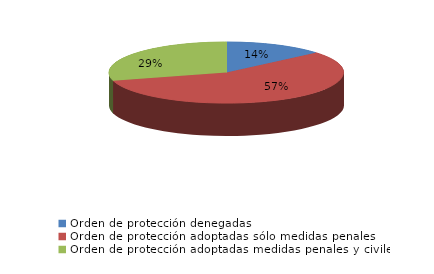
| Category | Series 0 |
|---|---|
| Orden de protección denegadas | 44 |
| Orden de protección adoptadas sólo medidas penales | 183 |
| Orden de protección adoptadas medidas penales y civiles | 94 |